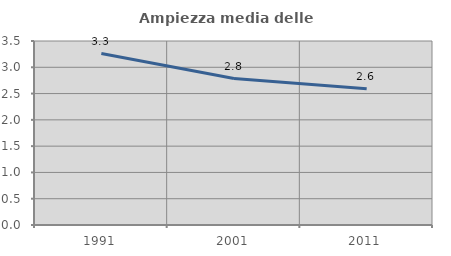
| Category | Ampiezza media delle famiglie |
|---|---|
| 1991.0 | 3.261 |
| 2001.0 | 2.785 |
| 2011.0 | 2.591 |